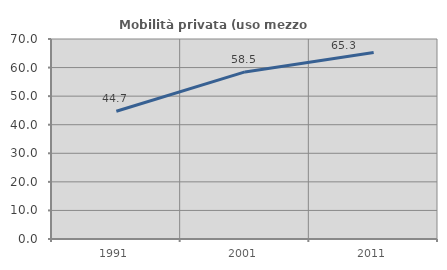
| Category | Mobilità privata (uso mezzo privato) |
|---|---|
| 1991.0 | 44.72 |
| 2001.0 | 58.488 |
| 2011.0 | 65.263 |